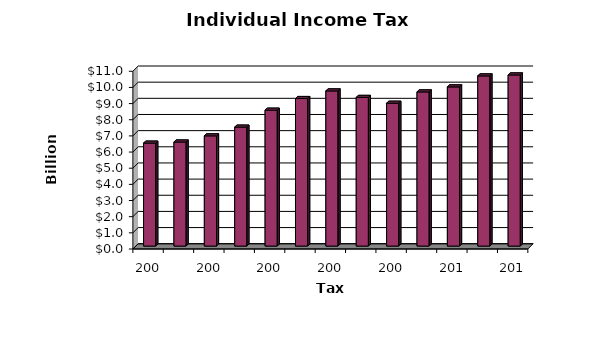
| Category | Series 0 |
|---|---|
| 2001.0 | 6.37 |
| 2002.0 | 6.44 |
| 2003.0 | 6.82 |
| 2004.0 | 7.36 |
| 2005.0 | 8.41 |
| 2006.0 | 9.13 |
| 2007.0 | 9.6 |
| 2008.0 | 9.2 |
| 2009.0 | 8.84 |
| 2010.0 | 9.54 |
| 2011.0 | 9.85 |
| 2012.0 | 10.53 |
| 2013.0 | 10.59 |